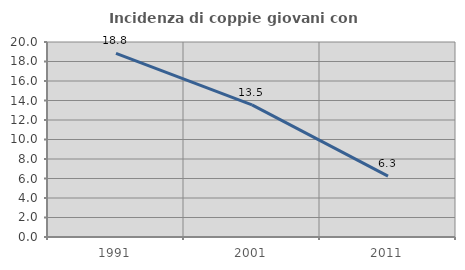
| Category | Incidenza di coppie giovani con figli |
|---|---|
| 1991.0 | 18.833 |
| 2001.0 | 13.543 |
| 2011.0 | 6.25 |